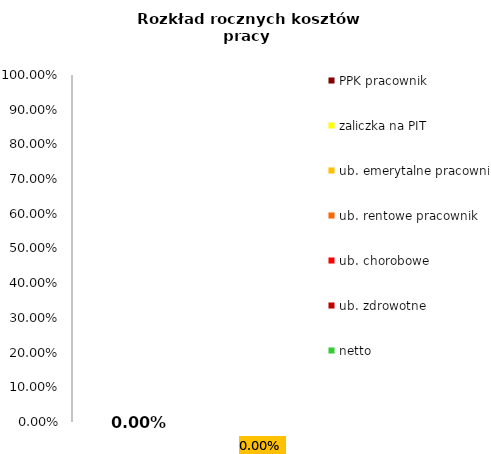
| Category | netto | ub. zdrowotne | ub. chorobowe | ub. rentowe pracownik | ub. emerytalne pracownik | zaliczka na PIT | PPK pracownik |
|---|---|---|---|---|---|---|---|
| 0 | 0 | 0 | 0 | 0 | 0 | 0 | 0 |